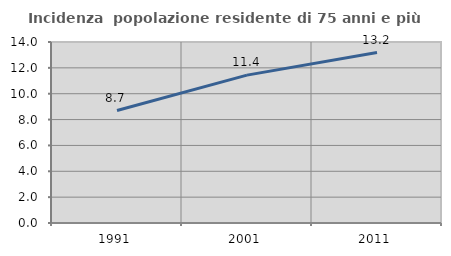
| Category | Incidenza  popolazione residente di 75 anni e più |
|---|---|
| 1991.0 | 8.699 |
| 2001.0 | 11.436 |
| 2011.0 | 13.181 |